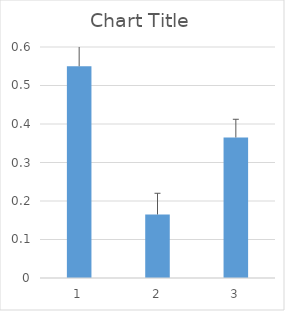
| Category | Series 0 |
|---|---|
| 0 | 0.55 |
| 1 | 0.165 |
| 2 | 0.365 |